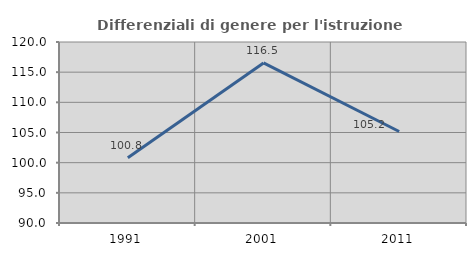
| Category | Differenziali di genere per l'istruzione superiore |
|---|---|
| 1991.0 | 100.812 |
| 2001.0 | 116.534 |
| 2011.0 | 105.167 |